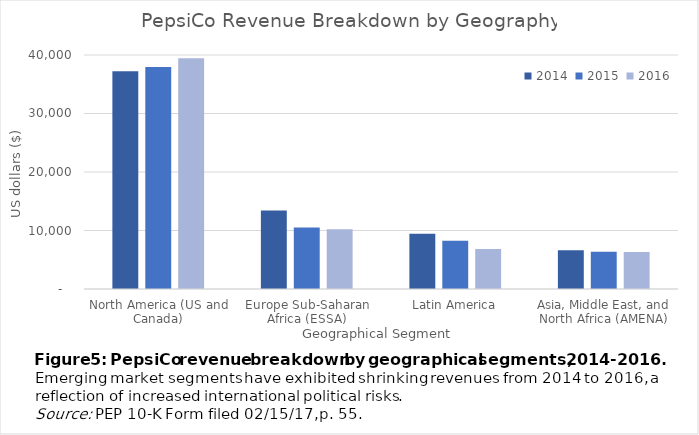
| Category | 2014 | 2015 | 2016 |
|---|---|---|---|
| North America (US and Canada) | 37241 | 37943 | 39425 |
| Europe Sub-Saharan Africa (ESSA) | 13399 | 10510 | 10216 |
| Latin America | 9425 | 8228 | 6820 |
| Asia, Middle East, and North Africa (AMENA) | 6618 | 6375 | 6338 |